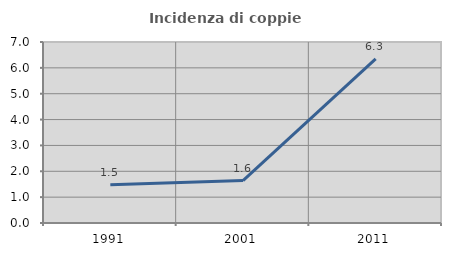
| Category | Incidenza di coppie miste |
|---|---|
| 1991.0 | 1.481 |
| 2001.0 | 1.639 |
| 2011.0 | 6.349 |